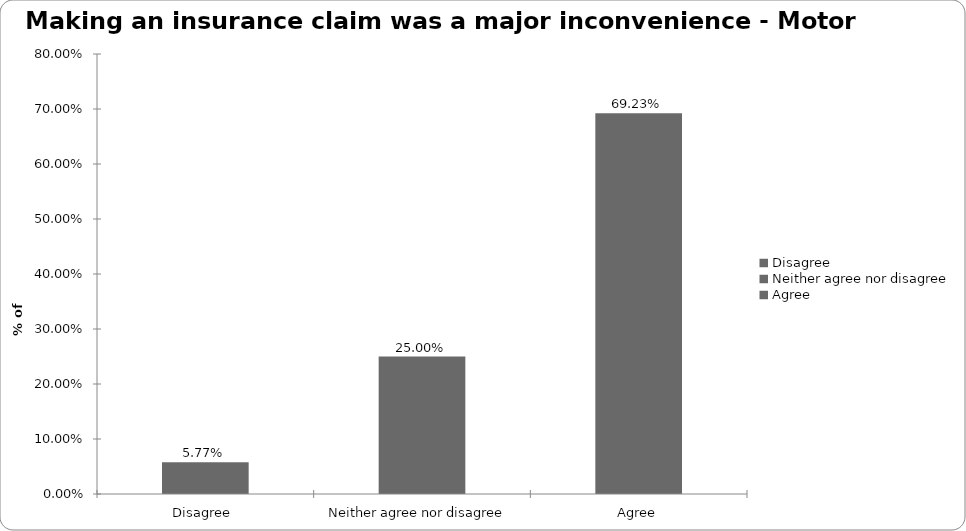
| Category | Motor |
|---|---|
| Disagree  | 0.058 |
| Neither agree nor disagree  | 0.25 |
| Agree | 0.692 |